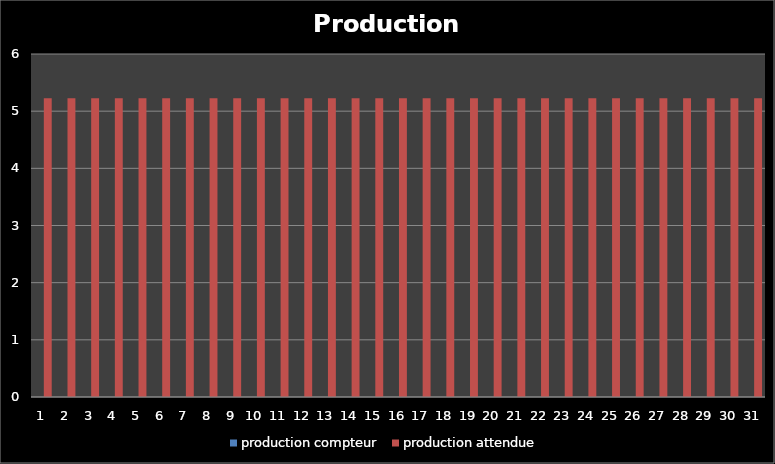
| Category | production compteur | production attendue |
|---|---|---|
| 1.0 | 0 | 5.226 |
| 2.0 | 0 | 5.226 |
| 3.0 | 0 | 5.226 |
| 4.0 | 0 | 5.226 |
| 5.0 | 0 | 5.226 |
| 6.0 | 0 | 5.226 |
| 7.0 | 0 | 5.226 |
| 8.0 | 0 | 5.226 |
| 9.0 | 0 | 5.226 |
| 10.0 | 0 | 5.226 |
| 11.0 | 0 | 5.226 |
| 12.0 | 0 | 5.226 |
| 13.0 | 0 | 5.226 |
| 14.0 | 0 | 5.226 |
| 15.0 | 0 | 5.226 |
| 16.0 | 0 | 5.226 |
| 17.0 | 0 | 5.226 |
| 18.0 | 0 | 5.226 |
| 19.0 | 0 | 5.226 |
| 20.0 | 0 | 5.226 |
| 21.0 | 0 | 5.226 |
| 22.0 | 0 | 5.226 |
| 23.0 | 0 | 5.226 |
| 24.0 | 0 | 5.226 |
| 25.0 | 0 | 5.226 |
| 26.0 | 0 | 5.226 |
| 27.0 | 0 | 5.226 |
| 28.0 | 0 | 5.226 |
| 29.0 | 0 | 5.226 |
| 30.0 | 0 | 5.226 |
| 31.0 | 0 | 5.226 |